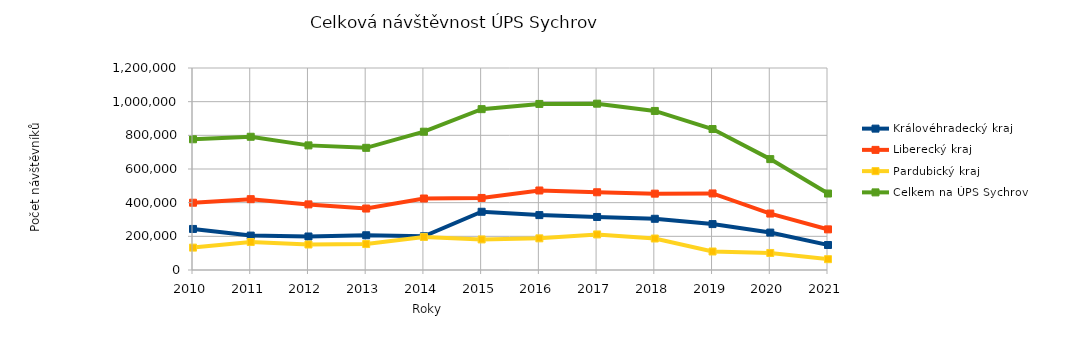
| Category | Královéhradecký kraj | Liberecký kraj | Pardubický kraj | Celkem na ÚPS Sychrov |
|---|---|---|---|---|
| 2010.0 | 243910 | 399672 | 133004 | 776586 |
| 2011.0 | 204481 | 420780 | 166238 | 791499 |
| 2012.0 | 199025 | 389781 | 151509 | 740315 |
| 2013.0 | 206419 | 365108 | 154165 | 725692 |
| 2014.0 | 200438 | 424718 | 196473 | 821629 |
| 2015.0 | 345970 | 428023 | 181567 | 955560 |
| 2016.0 | 326137 | 472318 | 188108 | 986563 |
| 2017.0 | 314983 | 461803 | 211268 | 988054 |
| 2018.0 | 304267 | 453568 | 187017 | 944852 |
| 2019.0 | 272720 | 454785 | 109949 | 837454 |
| 2020.0 | 222238 | 335261 | 101211 | 658710 |
| 2021.0 | 148598 | 241351 | 64267 | 454216 |